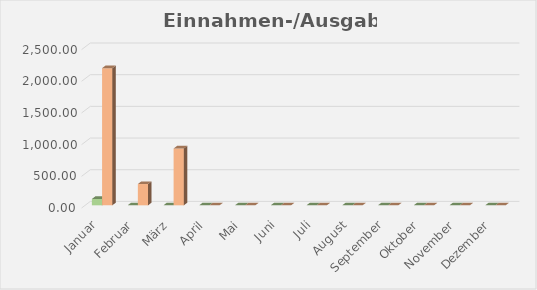
| Category | Series 0 | Series 1 |
|---|---|---|
| Januar | 100 | 2165.5 |
| Februar | 0 | 336 |
| März | 0 | 896.66 |
| April | 0 | 0 |
| Mai | 0 | 0 |
| Juni | 0 | 0 |
| Juli | 0 | 0 |
| August | 0 | 0 |
| September | 0 | 0 |
| Oktober | 0 | 0 |
| November | 0 | 0 |
| Dezember | 0 | 0 |